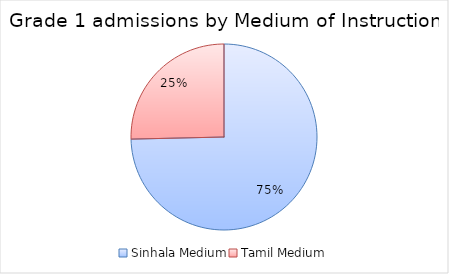
| Category | Series 0 |
|---|---|
| Sinhala Medium | 245271 |
| Tamil Medium | 83361 |